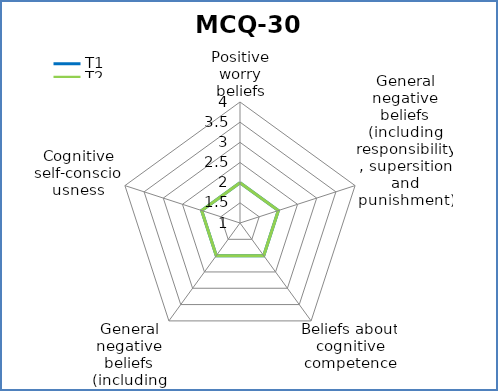
| Category | T1 | T2 |
|---|---|---|
| Positive worry beliefs | 0 | 0 |
| General negative beliefs (including responsibility, supersition and punishment) | 0 | 0 |
| Beliefs about cognitive competence | 0 | 0 |
| General negative beliefs (including responsibility, supersition and punishment) | 0 | 0 |
| Cognitive self-consciousness | 0 | 0 |